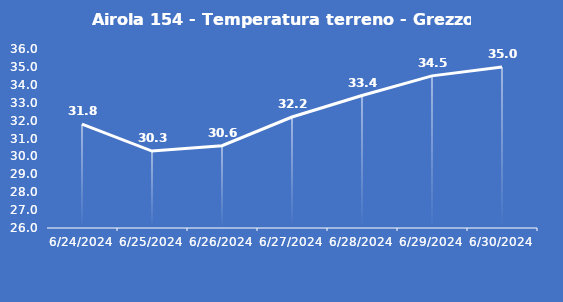
| Category | Airola 154 - Temperatura terreno - Grezzo (°C) |
|---|---|
| 6/24/24 | 31.8 |
| 6/25/24 | 30.3 |
| 6/26/24 | 30.6 |
| 6/27/24 | 32.2 |
| 6/28/24 | 33.4 |
| 6/29/24 | 34.5 |
| 6/30/24 | 35 |